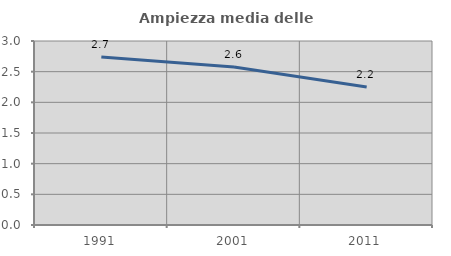
| Category | Ampiezza media delle famiglie |
|---|---|
| 1991.0 | 2.739 |
| 2001.0 | 2.574 |
| 2011.0 | 2.249 |